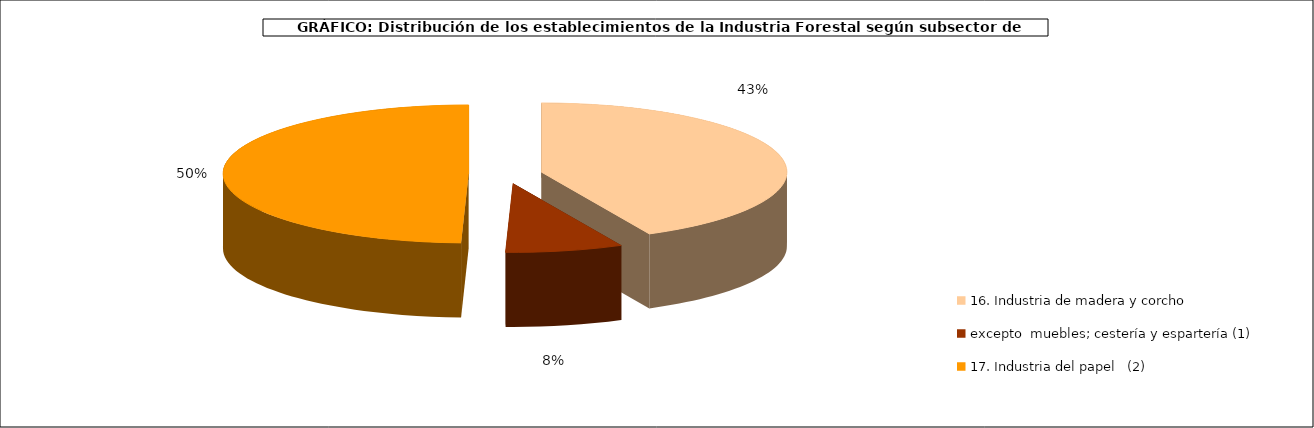
| Category | 16. Industria de madera y corcho, excepto  muebles; cestería y espartería (1) |
|---|---|
| 0 | 11263 |
| 1 | 2040 |
| 2 | 13045 |